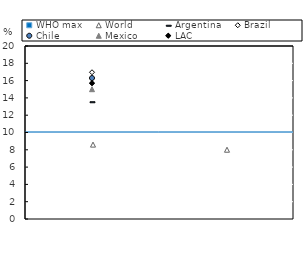
| Category | WHO max |
|---|---|
| 0 | 0.08 |
| 1 | 0.08 |